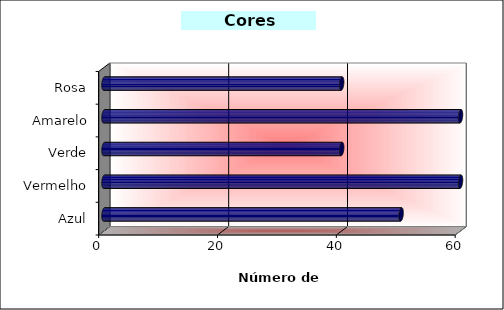
| Category | Número de pessoas |
|---|---|
| Azul | 50 |
| Vermelho | 60 |
| Verde | 40 |
| Amarelo | 60 |
| Rosa | 40 |